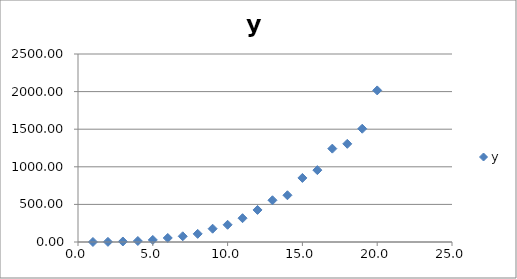
| Category | y |
|---|---|
| 1.0 | 0.223 |
| 2.0 | 1.98 |
| 3.0 | 6.802 |
| 4.0 | 13.416 |
| 5.0 | 27.367 |
| 6.0 | 53.444 |
| 7.0 | 75.998 |
| 8.0 | 108.194 |
| 9.0 | 176.695 |
| 10.0 | 228.845 |
| 11.0 | 316.613 |
| 12.0 | 426.207 |
| 13.0 | 555.078 |
| 14.0 | 621.585 |
| 15.0 | 851.902 |
| 16.0 | 955.682 |
| 17.0 | 1241.618 |
| 18.0 | 1305.289 |
| 19.0 | 1506.283 |
| 20.0 | 2015.726 |